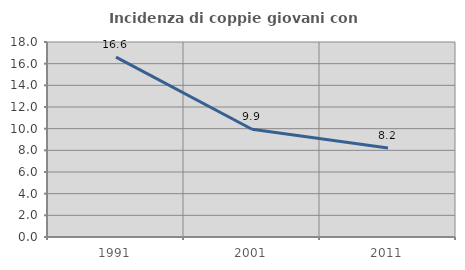
| Category | Incidenza di coppie giovani con figli |
|---|---|
| 1991.0 | 16.603 |
| 2001.0 | 9.946 |
| 2011.0 | 8.213 |